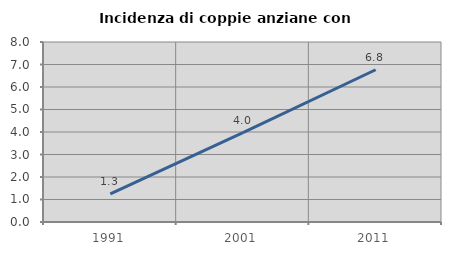
| Category | Incidenza di coppie anziane con figli |
|---|---|
| 1991.0 | 1.25 |
| 2001.0 | 3.974 |
| 2011.0 | 6.767 |